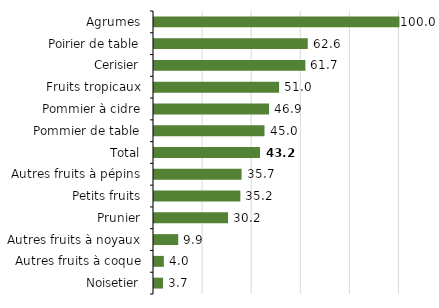
| Category | Series 0 |
|---|---|
| Noisetier | 3.682 |
| Autres fruits à coque | 4.023 |
| Autres fruits à noyaux | 9.865 |
| Prunier | 30.179 |
| Petits fruits | 35.189 |
| Autres fruits à pépins | 35.688 |
| Total | 43.178 |
| Pommier de table | 45.023 |
| Pommier à cidre | 46.872 |
| Fruits tropicaux | 50.966 |
| Cerisier | 61.685 |
| Poirier de table | 62.649 |
| Agrumes | 100 |